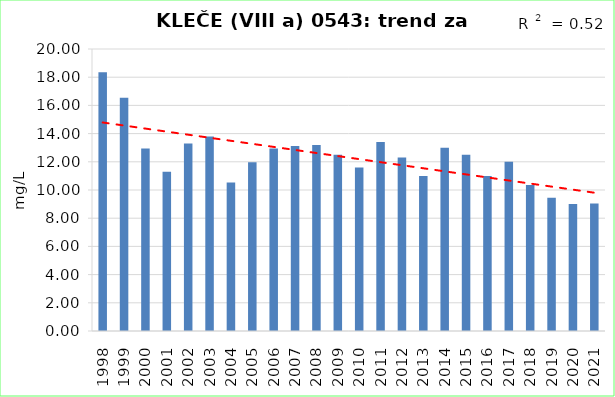
| Category | Vsota |
|---|---|
| 1998 | 18.35 |
| 1999 | 16.55 |
| 2000 | 12.95 |
| 2001 | 11.3 |
| 2002 | 13.3 |
| 2003 | 13.8 |
| 2004 | 10.525 |
| 2005 | 11.967 |
| 2006 | 12.95 |
| 2007 | 13.125 |
| 2008 | 13.2 |
| 2009 | 12.5 |
| 2010 | 11.6 |
| 2011 | 13.4 |
| 2012 | 12.3 |
| 2013 | 11 |
| 2014 | 13 |
| 2015 | 12.5 |
| 2016 | 11 |
| 2017 | 12 |
| 2018 | 10.35 |
| 2019 | 9.45 |
| 2020 | 9 |
| 2021 | 9.05 |